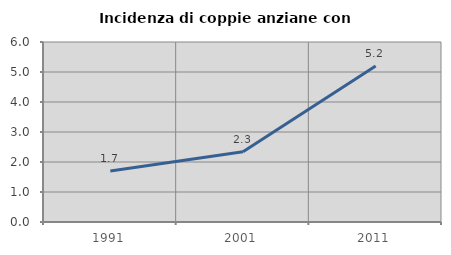
| Category | Incidenza di coppie anziane con figli |
|---|---|
| 1991.0 | 1.7 |
| 2001.0 | 2.339 |
| 2011.0 | 5.199 |